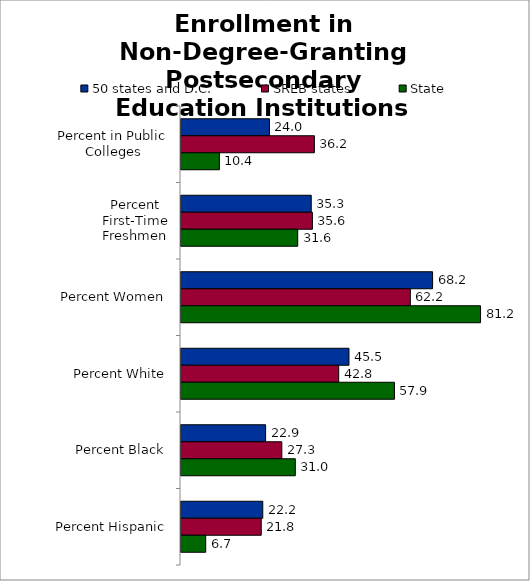
| Category | 50 states and D.C. | SREB states | State |
|---|---|---|---|
| 0 | 23.976 | 36.161 | 10.409 |
| 1 | 35.307 | 35.625 | 31.638 |
| 2 | 68.202 | 62.17 | 81.204 |
| 3 | 45.537 | 42.751 | 57.866 |
| 4 | 22.94 | 27.335 | 30.987 |
| 5 | 22.169 | 21.752 | 6.693 |